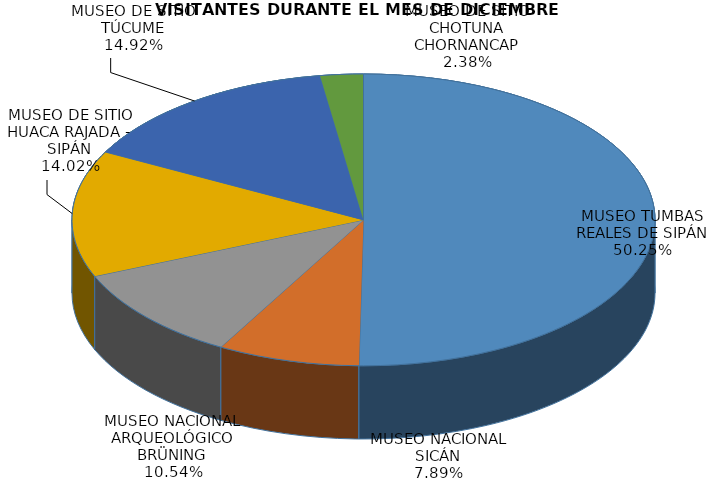
| Category | Visi |
|---|---|
| MUSEO TUMBAS REALES DE SIPÁN | 8171 |
| MUSEO NACIONAL SICÁN | 1283 |
| MUSEO NACIONAL ARQUEOLÓGICO BRÜNING | 1714 |
| MUSEO DE SITIO HUACA RAJADA - SIPÁN | 2280 |
| MUSEO DE SITIO TÚCUME | 2427 |
| MUSEO DE SITIO CHOTUNA CHORNANCAP | 387 |